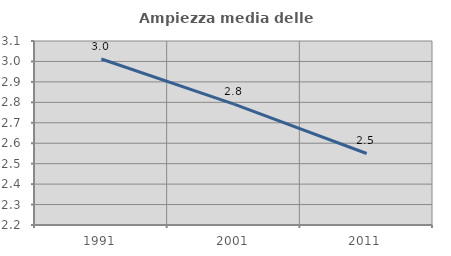
| Category | Ampiezza media delle famiglie |
|---|---|
| 1991.0 | 3.012 |
| 2001.0 | 2.791 |
| 2011.0 | 2.55 |